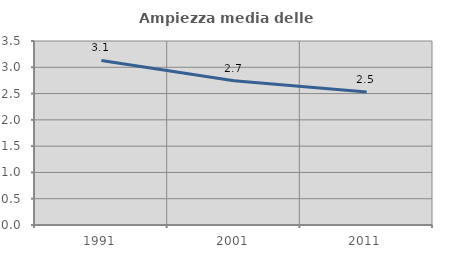
| Category | Ampiezza media delle famiglie |
|---|---|
| 1991.0 | 3.13 |
| 2001.0 | 2.744 |
| 2011.0 | 2.528 |